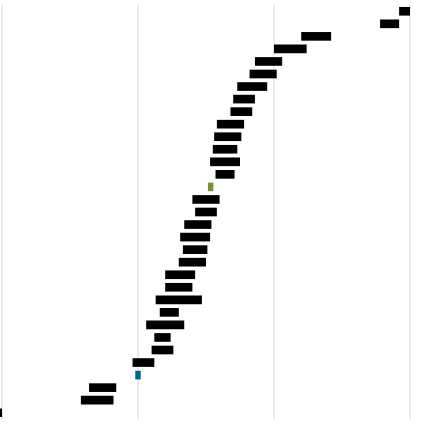
| Category | Series 0 | Series 1 | Series 2 | Series 3 | Series 4 | Series 5 |
|---|---|---|---|---|---|---|
| Country | 477 | 79 | 40 | 9 | 44 | 62 |